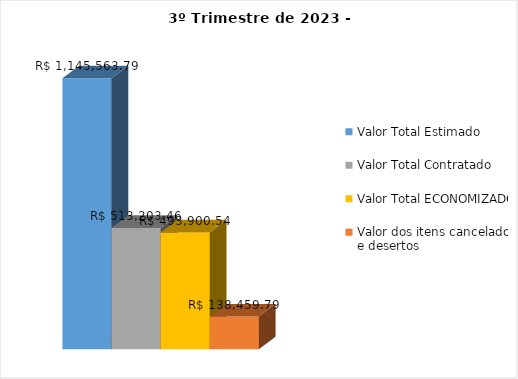
| Category | Valor Total Estimado | Valor Total Contratado | Valor Total ECONOMIZADO | Valor dos itens cancelados e desertos |
|---|---|---|---|---|
| 0 | 1145563.79 | 513203.46 | 493900.54 | 138459.79 |